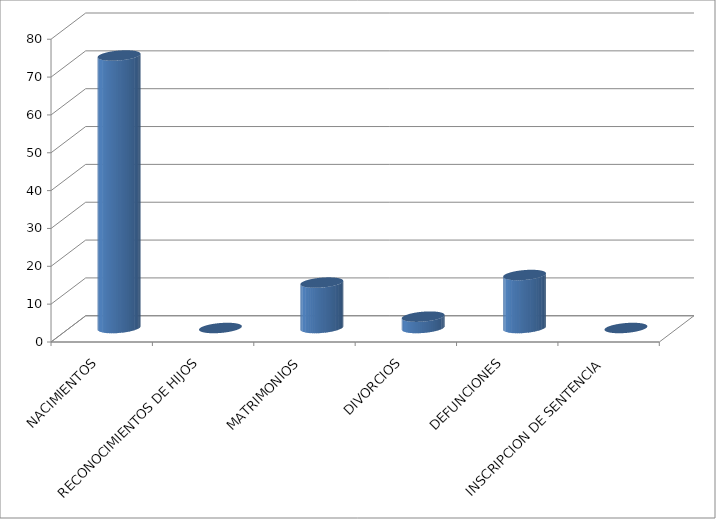
| Category | Series 0 |
|---|---|
| NACIMIENTOS | 72 |
| RECONOCIMIENTOS DE HIJOS | 0 |
| MATRIMONIOS | 12 |
| DIVORCIOS | 3 |
| DEFUNCIONES | 14 |
| INSCRIPCION DE SENTENCIA | 0 |